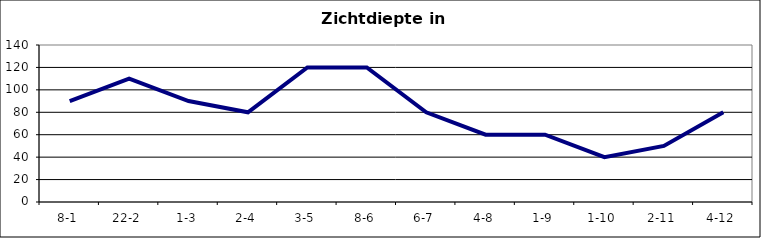
| Category | Zichtdiepte in cm |
|---|---|
| 8-1 | 90 |
| 22-2 | 110 |
| 1-3 | 90 |
| 2-4 | 80 |
| 3-5 | 120 |
| 8-6 | 120 |
| 6-7 | 80 |
| 4-8 | 60 |
| 1-9 | 60 |
| 1-10 | 40 |
| 2-11 | 50 |
| 4-12 | 80 |